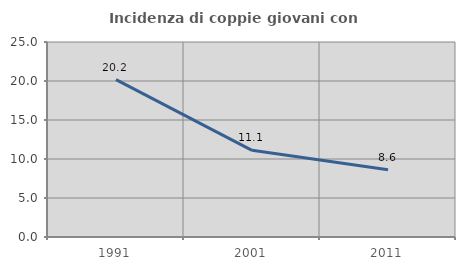
| Category | Incidenza di coppie giovani con figli |
|---|---|
| 1991.0 | 20.175 |
| 2001.0 | 11.111 |
| 2011.0 | 8.621 |